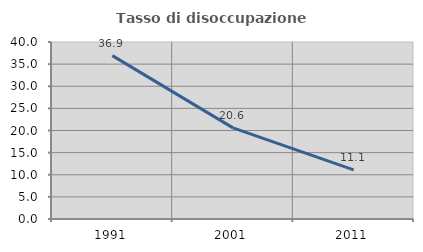
| Category | Tasso di disoccupazione giovanile  |
|---|---|
| 1991.0 | 36.913 |
| 2001.0 | 20.588 |
| 2011.0 | 11.111 |